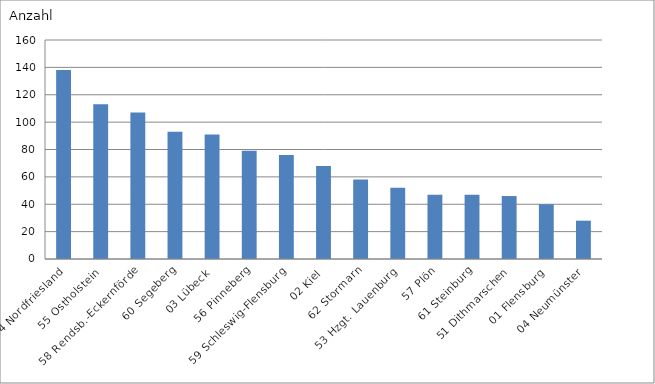
| Category | 54 Nordfriesland |
|---|---|
| 54 Nordfriesland | 138 |
| 55 Ostholstein | 113 |
| 58 Rendsb.-Eckernförde | 107 |
| 60 Segeberg | 93 |
| 03 Lübeck | 91 |
| 56 Pinneberg | 79 |
| 59 Schleswig-Flensburg | 76 |
| 02 Kiel | 68 |
| 62 Stormarn | 58 |
| 53 Hzgt. Lauenburg | 52 |
| 57 Plön | 47 |
| 61 Steinburg | 47 |
| 51 Dithmarschen | 46 |
| 01 Flensburg | 40 |
| 04 Neumünster | 28 |